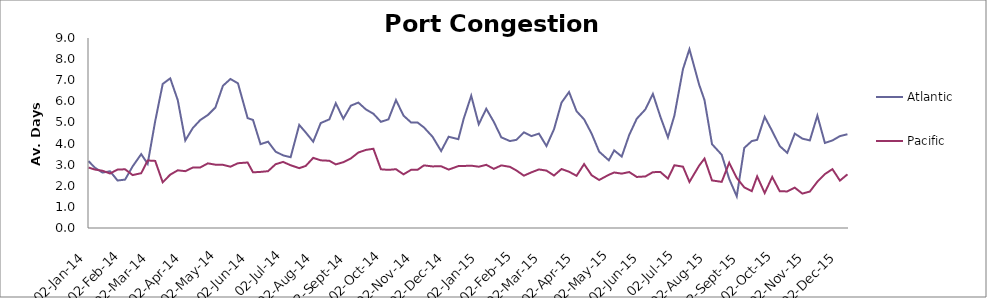
| Category | Atlantic  | Pacific |
|---|---|---|
| 2014-01-02 | 3.167 | 2.863 |
| 2014-01-08 | 2.854 | 2.767 |
| 2014-01-15 | 2.625 | 2.712 |
| 2014-01-22 | 2.688 | 2.582 |
| 2014-01-29 | 2.25 | 2.767 |
| 2014-02-05 | 2.292 | 2.781 |
| 2014-02-12 | 2.917 | 2.507 |
| 2014-02-20 | 3.5 | 2.596 |
| 2014-02-26 | 3.042 | 3.199 |
| 2014-03-05 | 5.059 | 3.178 |
| 2014-03-12 | 6.824 | 2.164 |
| 2014-03-19 | 7.088 | 2.527 |
| 2014-03-26 | 6.059 | 2.733 |
| 2014-04-02 | 4.147 | 2.692 |
| 2014-04-09 | 4.735 | 2.863 |
| 2014-04-16 | 5.118 | 2.87 |
| 2014-04-23 | 5.353 | 3.062 |
| 2014-04-30 | 5.706 | 3 |
| 2014-05-07 | 6.735 | 2.993 |
| 2014-05-14 | 7.059 | 2.904 |
| 2014-05-21 | 6.853 | 3.068 |
| 2014-05-30 | 5.206 | 3.103 |
| 2014-06-04 | 5.118 | 2.637 |
| 2014-06-11 | 3.971 | 2.658 |
| 2014-06-18 | 4.088 | 2.692 |
| 2014-06-25 | 3.618 | 3.021 |
| 2014-07-02 | 3.441 | 3.13 |
| 2014-07-09 | 3.353 | 2.973 |
| 2014-07-17 | 4.882 | 2.836 |
| 2014-07-23 | 4.529 | 2.938 |
| 2014-07-30 | 4.088 | 3.322 |
| 2014-08-06 | 4.971 | 3.205 |
| 2014-08-14 | 5.147 | 3.185 |
| 2014-08-20 | 5.912 | 3.014 |
| 2014-08-27 | 5.176 | 3.116 |
| 2014-09-03 | 5.794 | 3.295 |
| 2014-09-10 | 5.941 | 3.575 |
| 2014-09-17 | 5.618 | 3.699 |
| 2014-09-24 | 5.412 | 3.753 |
| 2014-10-01 | 5.029 | 2.781 |
| 2014-10-08 | 5.147 | 2.753 |
| 2014-10-15 | 6.059 | 2.785 |
| 2014-10-22 | 5.324 | 2.541 |
| 2014-10-29 | 5 | 2.753 |
| 2014-11-04 | 5 | 2.753 |
| 2014-11-10 | 4.765 | 2.966 |
| 2014-11-18 | 4.324 | 2.918 |
| 2014-11-26 | 3.647 | 2.925 |
| 2014-12-03 | 4.324 | 2.767 |
| 2014-12-12 | 4.206 | 2.932 |
| 2014-12-17 | 5.176 | 2.938 |
| 2014-12-24 | 6.265 | 2.952 |
| 2014-12-31 | 4.912 | 2.904 |
| 2015-01-07 | 5.647 | 2.993 |
| 2015-01-14 | 5.029 | 2.801 |
| 2015-01-21 | 4.294 | 2.966 |
| 2015-01-29 | 4.118 | 2.897 |
| 2015-02-04 | 4.176 | 2.726 |
| 2015-02-11 | 4.529 | 2.479 |
| 2015-02-18 | 4.353 | 2.637 |
| 2015-02-25 | 4.471 | 2.774 |
| 2015-03-04 | 3.882 | 2.719 |
| 2015-03-11 | 4.676 | 2.486 |
| 2015-03-18 | 5.941 | 2.795 |
| 2015-03-25 | 6.441 | 2.664 |
| 2015-04-01 | 5.529 | 2.473 |
| 2015-04-08 | 5.147 | 3.027 |
| 2015-04-15 | 4.471 | 2.5 |
| 2015-04-22 | 3.618 | 2.274 |
| 2015-05-01 | 3.206 | 2.521 |
| 2015-05-06 | 3.676 | 2.63 |
| 2015-05-13 | 3.382 | 2.575 |
| 2015-05-20 | 4.412 | 2.651 |
| 2015-05-27 | 5.176 | 2.418 |
| 2015-06-04 | 5.618 | 2.442 |
| 2015-06-11 | 6.353 | 2.645 |
| 2015-06-18 | 5.265 | 2.651 |
| 2015-06-25 | 4.294 | 2.342 |
| 2015-07-01 | 5.324 | 2.973 |
| 2015-07-09 | 7.529 | 2.904 |
| 2015-07-15 | 8.471 | 2.182 |
| 2015-07-24 | 6.794 | 2.952 |
| 2015-07-29 | 6.059 | 3.288 |
| 2015-08-05 | 3.971 | 2.253 |
| 2015-08-14 | 3.471 | 2.185 |
| 2015-08-21 | 2.324 | 3.089 |
| 2015-08-28 | 1.5 | 2.37 |
| 2015-09-04 | 3.794 | 1.925 |
| 2015-09-11 | 4.118 | 1.747 |
| 2015-09-16 | 4.176 | 2.445 |
| 2015-09-23 | 5.265 | 1.658 |
| 2015-09-30 | 4.588 | 2.418 |
| 2015-10-07 | 3.882 | 1.74 |
| 2015-10-14 | 3.559 | 1.733 |
| 2015-10-21 | 4.471 | 1.911 |
| 2015-10-28 | 4.235 | 1.63 |
| 2015-11-04 | 4.147 | 1.726 |
| 2015-11-11 | 5.324 | 2.192 |
| 2015-11-18 | 4.029 | 2.555 |
| 2015-11-25 | 4.147 | 2.788 |
| 2015-12-02 | 4.353 | 2.247 |
| 2015-12-09 | 4.441 | 2.541 |